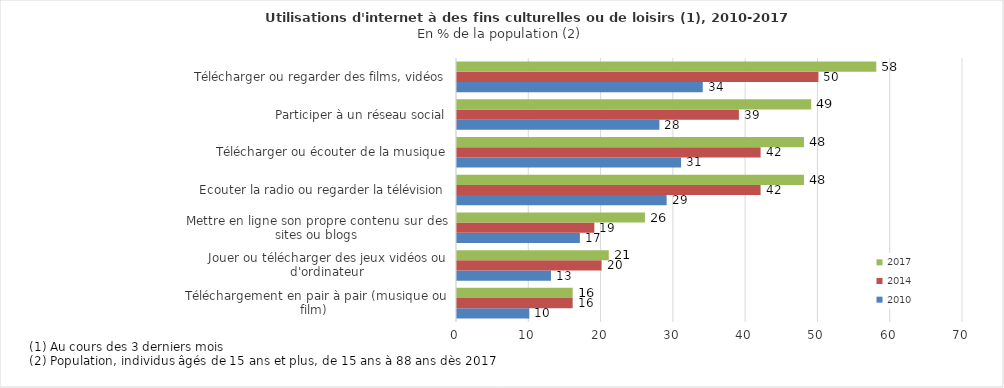
| Category | 2010 | 2014 | 2017 |
|---|---|---|---|
| Téléchargement en pair à pair (musique ou film)  | 10 | 16 | 16 |
| Jouer ou télécharger des jeux vidéos ou d'ordinateur | 13 | 20 | 21 |
| Mettre en ligne son propre contenu sur des sites ou blogs | 17 | 19 | 26 |
| Ecouter la radio ou regarder la télévision | 29 | 42 | 48 |
| Télécharger ou écouter de la musique | 31 | 42 | 48 |
| Participer à un réseau social | 28 | 39 | 49 |
| Télécharger ou regarder des films, vidéos | 34 | 50 | 58 |